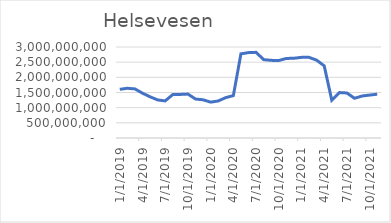
| Category | Helsevesen |
|---|---|
| 1/1/19 | 1604679583.333 |
| 2/1/19 | 1639167083.333 |
| 3/1/19 | 1618121250 |
| 4/1/19 | 1477577500 |
| 5/1/19 | 1358510833.333 |
| 6/1/19 | 1254712500 |
| 7/1/19 | 1223820833.333 |
| 8/1/19 | 1432250000 |
| 9/1/19 | 1436995833.333 |
| 10/1/19 | 1447958333.333 |
| 11/1/19 | 1284979166.667 |
| 12/1/19 | 1259033333.333 |
| 1/1/20 | 1182441666.667 |
| 2/1/20 | 1221191666.667 |
| 3/1/20 | 1331483333.333 |
| 4/1/20 | 1398108333.333 |
| 5/1/20 | 2774858333.333 |
| 6/1/20 | 2814875000 |
| 7/1/20 | 2824000000 |
| 8/1/20 | 2583937500 |
| 9/1/20 | 2559604166.667 |
| 10/1/20 | 2554195833.333 |
| 11/1/20 | 2622637500 |
| 12/1/20 | 2629304166.667 |
| 1/1/21 | 2658645833.333 |
| 2/1/21 | 2658020833.333 |
| 3/1/21 | 2566020833.333 |
| 4/1/21 | 2377745833.333 |
| 5/1/21 | 1246954166.667 |
| 6/1/21 | 1497954166.667 |
| 7/1/21 | 1484079166.667 |
| 8/1/21 | 1309058333.333 |
| 9/1/21 | 1384083333.333 |
| 10/1/21 | 1415483333.333 |
| 11/1/21 | 1443791666.667 |